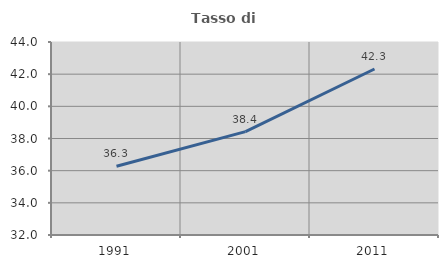
| Category | Tasso di occupazione   |
|---|---|
| 1991.0 | 36.278 |
| 2001.0 | 38.428 |
| 2011.0 | 42.32 |